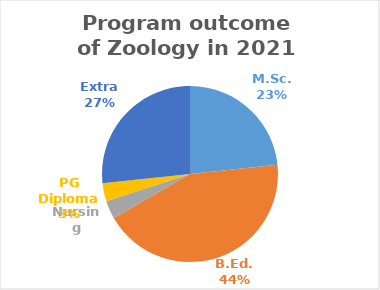
| Category | Series 0 |
|---|---|
| M.Sc. | 7 |
| B.Ed. | 13 |
| Nursing | 1 |
| PG Diploma | 1 |
| Extra | 8 |